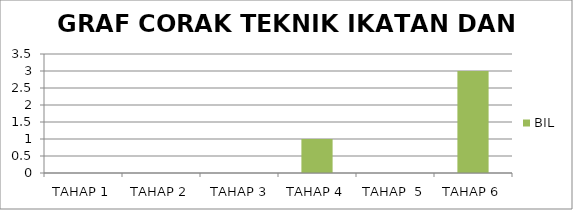
| Category | BIL |
|---|---|
| TAHAP 1 | 0 |
| TAHAP 2 | 0 |
|  TAHAP 3 | 0 |
| TAHAP 4 | 1 |
| TAHAP  5 | 0 |
| TAHAP 6 | 3 |